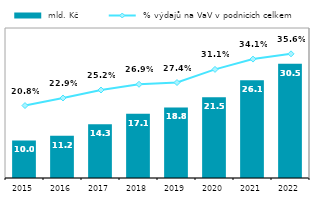
| Category |  mld. Kč |
|---|---|
| 2015.0 | 10 |
| 2016.0 | 11.234 |
| 2017.0 | 14.33 |
| 2018.0 | 17.101 |
| 2019.0 | 18.83 |
| 2020.0 | 21.517 |
| 2021.0 | 26.096 |
| 2022.0 | 30.469 |